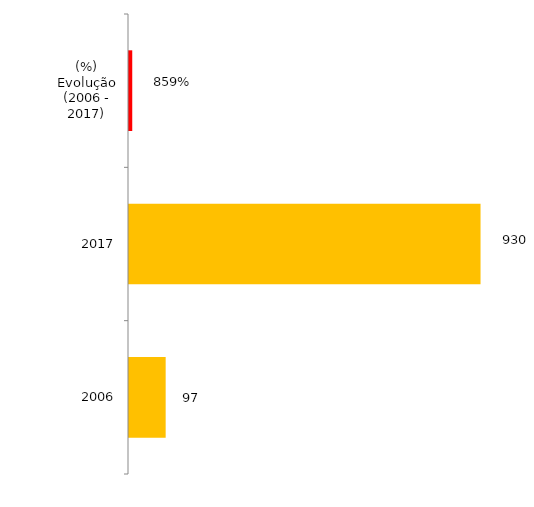
| Category | Téc. Adm. |
|---|---|
| 2006 | 97 |
| 2017 | 930 |
| (%) Evolução (2006 - 2017) | 8.588 |